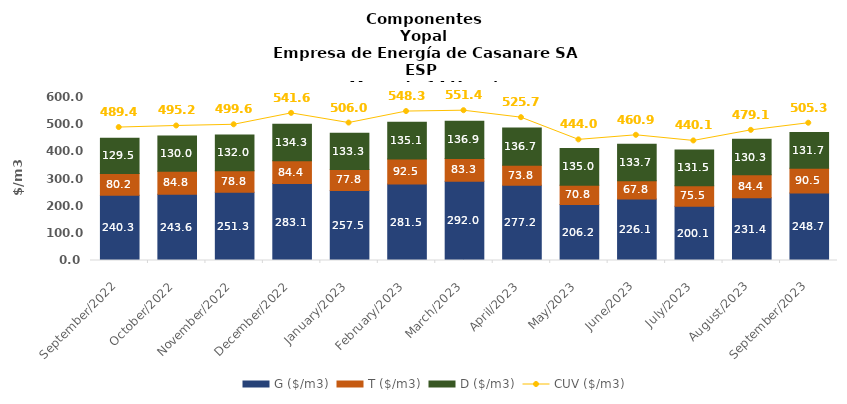
| Category | G ($/m3) | T ($/m3) | D ($/m3) |
|---|---|---|---|
| 2022-09-01 | 240.31 | 80.24 | 129.54 |
| 2022-10-01 | 243.58 | 84.76 | 129.96 |
| 2022-11-01 | 251.27 | 78.75 | 131.99 |
| 2022-12-01 | 283.07 | 84.41 | 134.3 |
| 2023-01-01 | 257.508 | 77.815 | 133.258 |
| 2023-02-01 | 281.451 | 92.545 | 135.074 |
| 2023-03-01 | 292.028 | 83.345 | 136.946 |
| 2023-04-01 | 277.158 | 73.848 | 136.749 |
| 2023-05-01 | 206.218 | 70.832 | 134.954 |
| 2023-06-01 | 226.097 | 67.766 | 133.705 |
| 2023-07-01 | 200.103 | 75.481 | 131.466 |
| 2023-08-01 | 231.393 | 84.415 | 130.283 |
| 2023-09-01 | 248.694 | 90.492 | 131.705 |